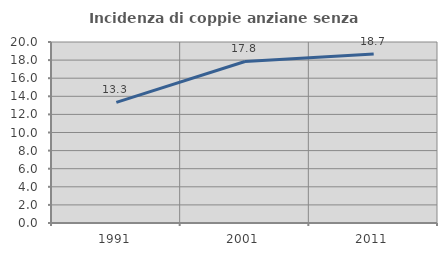
| Category | Incidenza di coppie anziane senza figli  |
|---|---|
| 1991.0 | 13.333 |
| 2001.0 | 17.847 |
| 2011.0 | 18.675 |